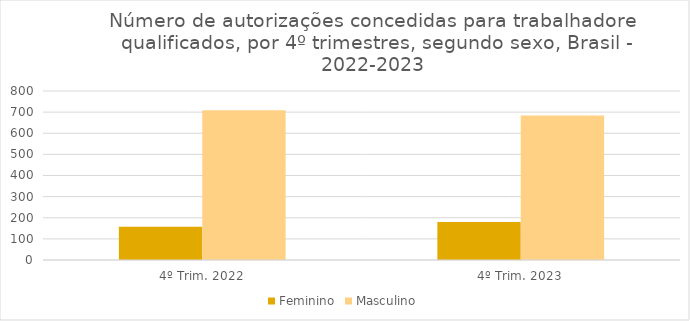
| Category | Feminino | Masculino |
|---|---|---|
| 4º Trim. 2022 | 157 | 709 |
| 4º Trim. 2023 | 180 | 684 |